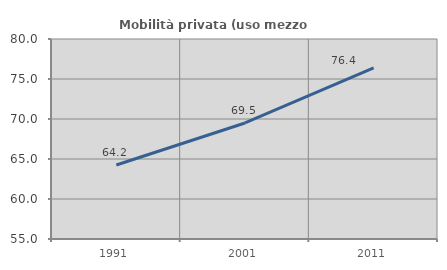
| Category | Mobilità privata (uso mezzo privato) |
|---|---|
| 1991.0 | 64.248 |
| 2001.0 | 69.504 |
| 2011.0 | 76.401 |